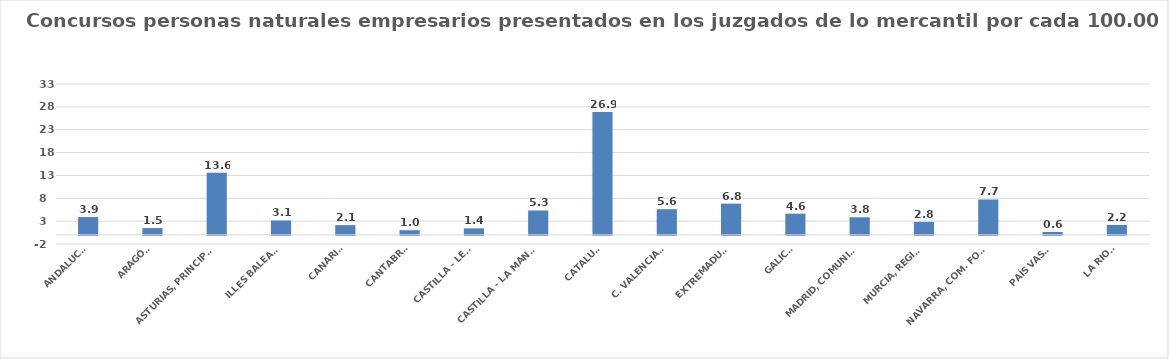
| Category | Series 0 |
|---|---|
| ANDALUCÍA | 3.888 |
| ARAGÓN | 1.482 |
| ASTURIAS, PRINCIPADO | 13.61 |
| ILLES BALEARS | 3.149 |
| CANARIAS | 2.124 |
| CANTABRIA | 1.019 |
| CASTILLA - LEÓN | 1.427 |
| CASTILLA - LA MANCHA | 5.335 |
| CATALUÑA | 26.902 |
| C. VALENCIANA | 5.615 |
| EXTREMADURA | 6.829 |
| GALICIA | 4.63 |
| MADRID, COMUNIDAD | 3.84 |
| MURCIA, REGIÓN | 2.834 |
| NAVARRA, COM. FORAL | 7.736 |
| PAÍS VASCO | 0.631 |
| LA RIOJA | 2.172 |